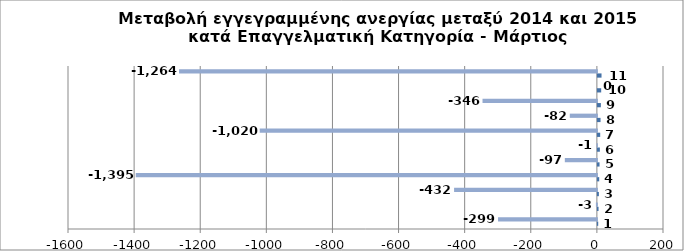
| Category | Series 0 | Series 1 |
|---|---|---|
| 0 | 1 | -299 |
| 1 | 2 | -3 |
| 2 | 3 | -432 |
| 3 | 4 | -1395 |
| 4 | 5 | -97 |
| 5 | 6 | -1 |
| 6 | 7 | -1020 |
| 7 | 8 | -82 |
| 8 | 9 | -346 |
| 9 | 10 | 0 |
| 10 | 11 | -1264 |